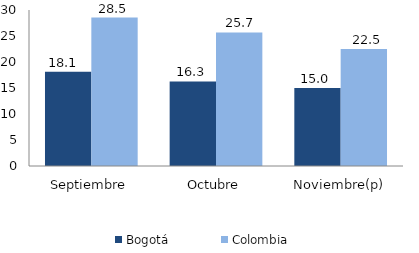
| Category | Bogotá | Colombia |
|---|---|---|
| Septiembre | 18.143 | 28.54 |
| Octubre | 16.266 | 25.695 |
| Noviembre(p) | 14.999 | 22.481 |